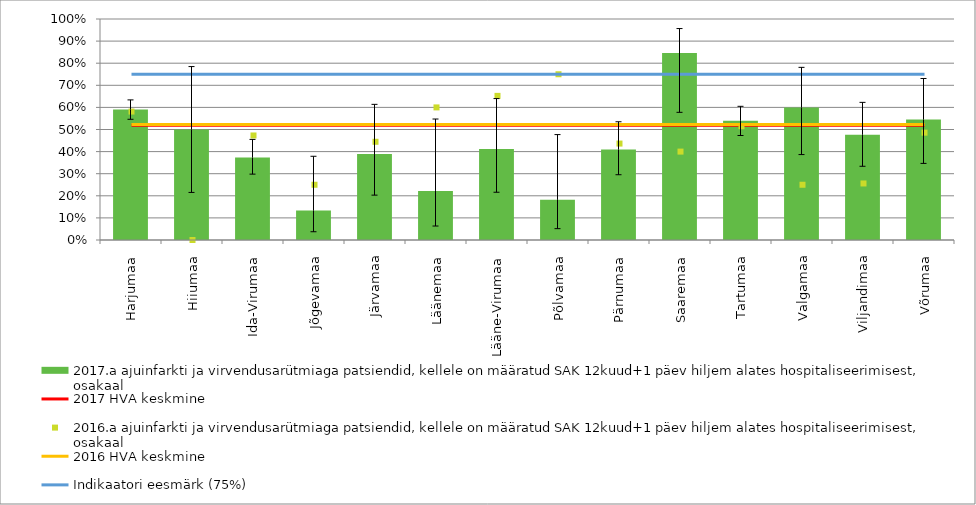
| Category | 2017.a ajuinfarkti ja virvendusarütmiaga patsiendid, kellele on määratud SAK 12kuud+1 päev hiljem alates hospitaliseerimisest, osakaal |
|---|---|
| Harjumaa | 0.591 |
| Hiiumaa | 0.5 |
| Ida-Virumaa | 0.373 |
| Jõgevamaa | 0.133 |
| Järvamaa | 0.389 |
| Läänemaa | 0.222 |
| Lääne-Virumaa | 0.412 |
| Põlvamaa | 0.182 |
| Pärnumaa | 0.41 |
| Saaremaa | 0.846 |
| Tartumaa | 0.54 |
| Valgamaa | 0.6 |
| Viljandimaa | 0.476 |
| Võrumaa | 0.545 |